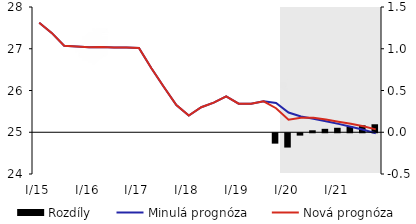
| Category | Rozdíly |
|---|---|
| 0 | 0 |
| 1 | 0 |
| 2 | 0 |
| 3 | 0 |
| 4 | 0 |
| 5 | 0 |
| 6 | 0 |
| 7 | 0 |
| 8 | 0 |
| 9 | 0 |
| 10 | 0 |
| 11 | 0 |
| 12 | 0 |
| 13 | 0 |
| 14 | 0 |
| 15 | 0 |
| 16 | 0 |
| 17 | 0 |
| 18 | 0 |
| 19 | -0.124 |
| 20 | -0.171 |
| 21 | -0.028 |
| 22 | 0.023 |
| 23 | 0.041 |
| 24 | 0.054 |
| 25 | 0.069 |
| 26 | 0.084 |
| 27 | 0.096 |